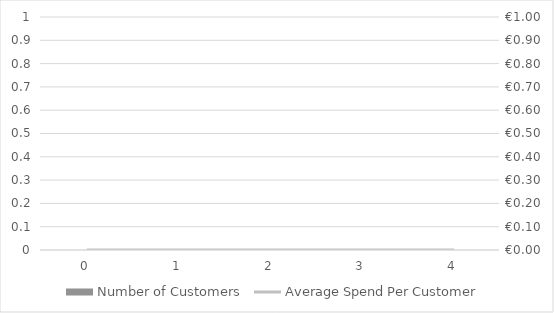
| Category | Number of Customers |
|---|---|
| 0.0 | 0 |
| 1.0 | 0 |
| 2.0 | 0 |
| 3.0 | 0 |
| 4.0 | 0 |